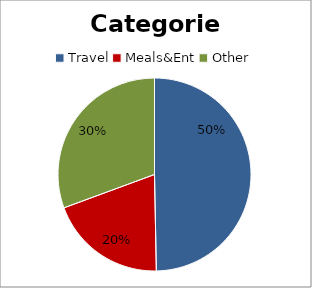
| Category | Series 0 |
|---|---|
| Travel | 988.4 |
| Meals&Ent | 391.54 |
| Other | 609 |